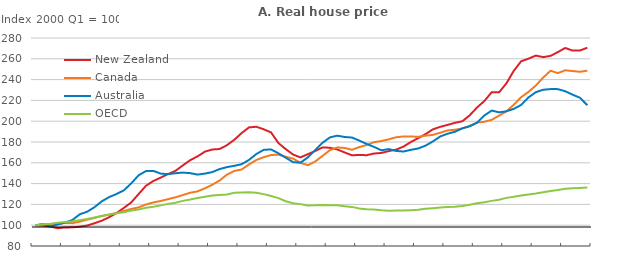
| Category | New Zealand | Canada | Australia | OECD |
|---|---|---|---|---|
|  | 100 | 100 | 100 | 100 |
| 2000Q2 | 99.599 | 100.591 | 101.132 | 100.929 |
| 2000Q3 | 98.625 | 100.848 | 98.934 | 101.385 |
| 2000Q4 | 97.147 | 101.187 | 100.664 | 102.361 |
|  | 97.863 | 102.277 | 102.525 | 103.057 |
| 2001Q2 | 97.936 | 101.967 | 105.052 | 103.703 |
| 2001Q3 | 98.605 | 103.429 | 110.506 | 104.878 |
| 2001Q4 | 99.677 | 105.362 | 112.959 | 105.912 |
|  | 101.892 | 107.02 | 117.329 | 107.304 |
| 2002Q2 | 104.345 | 108.852 | 123.006 | 108.792 |
| 2002Q3 | 107.741 | 110.149 | 127.07 | 110.194 |
| 2002Q4 | 111.733 | 111.72 | 130.018 | 111.552 |
|  | 116.676 | 113.685 | 133.56 | 112.398 |
| 2003Q2 | 121.934 | 115.619 | 140.288 | 114.046 |
| 2003Q3 | 129.983 | 117.137 | 148.026 | 115.118 |
| 2003Q4 | 137.963 | 119.906 | 152.073 | 116.73 |
|  | 142.508 | 121.881 | 152.225 | 117.814 |
| 2004Q2 | 145.756 | 123.303 | 149.592 | 119.067 |
| 2004Q3 | 149.21 | 125.073 | 149.085 | 120.492 |
| 2004Q4 | 152.227 | 126.812 | 149.97 | 121.672 |
|  | 157.446 | 128.979 | 150.589 | 123.409 |
| 2005Q2 | 162.494 | 131.2 | 150.079 | 124.665 |
| 2005Q3 | 166.157 | 132.488 | 148.635 | 126.123 |
| 2005Q4 | 170.695 | 135.454 | 149.627 | 127.356 |
|  | 172.783 | 138.858 | 151.046 | 128.515 |
| 2006Q2 | 173.25 | 142.967 | 153.958 | 129.155 |
| 2006Q3 | 176.921 | 148.582 | 155.848 | 129.442 |
| 2006Q4 | 182.108 | 152.174 | 157.1 | 131.232 |
|  | 188.577 | 153.548 | 158.628 | 131.395 |
| 2007Q2 | 194.047 | 158.408 | 162.784 | 131.596 |
| 2007Q3 | 194.661 | 162.703 | 168.438 | 131.193 |
| 2007Q4 | 192.224 | 165.396 | 172.462 | 129.888 |
|  | 189.224 | 167.478 | 172.872 | 128.06 |
| 2008Q2 | 178.974 | 167.874 | 169.144 | 126.08 |
| 2008Q3 | 173.137 | 165.826 | 164.867 | 123.066 |
| 2008Q4 | 167.905 | 164 | 160.628 | 121.11 |
|  | 165.186 | 159.966 | 160.096 | 120.268 |
| 2009Q2 | 168.301 | 157.718 | 165.244 | 119.019 |
| 2009Q3 | 171.327 | 161.269 | 172.142 | 119.131 |
| 2009Q4 | 174.828 | 166.604 | 179.283 | 119.495 |
|  | 174.476 | 172.158 | 184.384 | 119.174 |
| 2010Q2 | 172.823 | 174.715 | 186.096 | 119.069 |
| 2010Q3 | 169.977 | 174.298 | 184.837 | 118.325 |
| 2010Q4 | 167.22 | 172.511 | 184.293 | 117.608 |
|  | 167.556 | 175.1 | 181.369 | 116.136 |
| 2011Q2 | 167.299 | 177.133 | 178.103 | 115.254 |
| 2011Q3 | 168.928 | 179.859 | 175.295 | 115.043 |
| 2011Q4 | 169.459 | 180.897 | 172.011 | 114.32 |
|  | 171.238 | 182.557 | 173.176 | 113.907 |
| 2012Q2 | 172.641 | 184.564 | 171.428 | 114.02 |
| 2012Q3 | 175.538 | 185.311 | 170.843 | 114.169 |
| 2012Q4 | 179.957 | 185.331 | 172.449 | 114.437 |
|  | 183.72 | 184.95 | 173.753 | 114.748 |
| 2013Q2 | 187.551 | 186.084 | 176.492 | 115.814 |
| 2013Q3 | 192.164 | 186.844 | 180.549 | 116.36 |
| 2013Q4 | 194.563 | 188.932 | 185.291 | 116.915 |
|  | 196.455 | 191.155 | 187.98 | 117.408 |
| 2014Q2 | 198.446 | 191.765 | 189.837 | 117.774 |
| 2014Q3 | 199.897 | 193.036 | 193.109 | 118.528 |
| 2014Q4 | 205.615 | 195.456 | 195.073 | 119.703 |
|  | 213.132 | 198.75 | 198.477 | 121.187 |
| 2015Q2 | 219.408 | 199.401 | 205.489 | 122.015 |
| 2015Q3 | 227.85 | 201.328 | 210.252 | 123.383 |
| 2015Q4 | 227.746 | 205.351 | 208.547 | 124.518 |
| 2016Q1 | 236.378 | 209.46 | 209.525 | 126.271 |
| 2016Q2 | 248.453 | 215.826 | 211.854 | 127.284 |
| 2016Q3 | 257.614 | 223.047 | 215.653 | 128.58 |
| 2016Q4 | 260.139 | 228.181 | 222.867 | 129.472 |
| 2017Q1 | 263.106 | 234.293 | 227.914 | 130.378 |
| 2017Q2 | 261.616 | 241.932 | 230.247 | 131.735 |
| 2017Q3 | 262.821 | 248.535 | 230.87 | 132.974 |
| 2017Q4 | 266.467 | 246.257 | 230.835 | 133.745 |
|  | 270.414 | 248.98 | 228.784 | 134.935 |
| 2018Q2 | 267.891 | 248.193 | 225.516 | 135.451 |
| 2018Q3 | 267.993 | 247.547 | 222.521 | 135.8 |
| 2018Q4 | 270.651 | 248.61 | 215.396 | 136.283 |